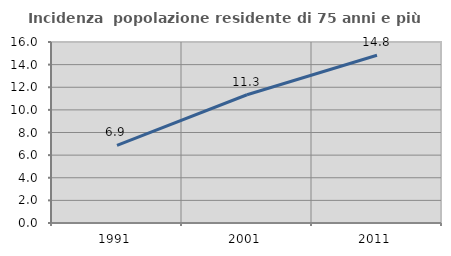
| Category | Incidenza  popolazione residente di 75 anni e più |
|---|---|
| 1991.0 | 6.858 |
| 2001.0 | 11.339 |
| 2011.0 | 14.826 |